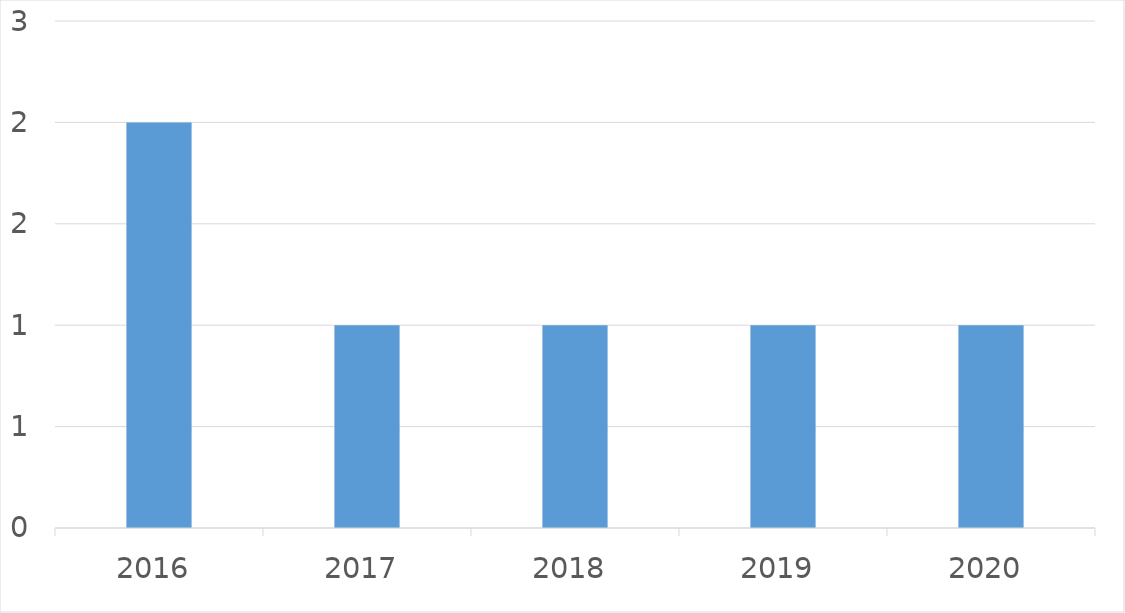
| Category | Series 0 |
|---|---|
| 2016 | 2 |
| 2017 | 1 |
| 2018 | 1 |
| 2019 | 1 |
| 2020 | 1 |